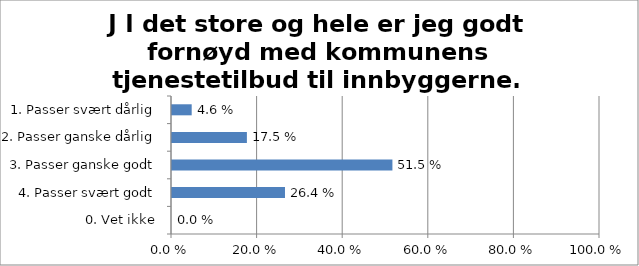
| Category | J I det store og hele er jeg godt fornøyd med kommunens tjenestetilbud til innbyggerne. |
|---|---|
| 1. Passer svært dårlig | 0.046 |
| 2. Passer ganske dårlig | 0.175 |
| 3. Passer ganske godt | 0.515 |
| 4. Passer svært godt | 0.264 |
| 0. Vet ikke | 0 |